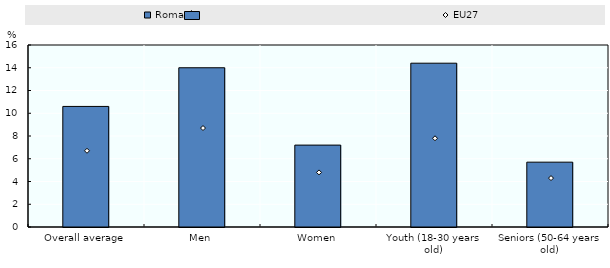
| Category | Romania |
|---|---|
| Overall average | 10.6 |
| Men | 14 |
| Women | 7.2 |
| Youth (18-30 years old) | 14.4 |
| Seniors (50-64 years old) | 5.7 |